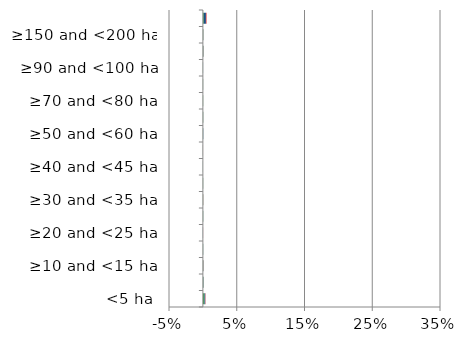
| Category | England | Scotland | Wales |
|---|---|---|---|
| <5 ha | 0.002 | 0.001 | 0 |
| ≥5 and <10 ha | 0.001 | 0 | 0 |
| ≥10 and <15 ha | 0.001 | 0 | 0 |
| ≥15 and <20 ha | 0 | 0 | 0 |
| ≥20 and <25 ha | 0 | 0 | 0 |
| ≥25 and <30 ha | 0 | 0 | 0 |
| ≥30 and <35 ha | 0 | 0 | 0 |
| ≥35 and <40 ha | 0 | 0 | 0 |
| ≥40 and <45 ha | 0 | 0 | 0 |
| ≥45 and <50 ha | 0 | 0 | 0 |
| ≥50 and <60 ha | 0 | 0 | 0 |
| ≥60 and <70 ha | 0 | 0 | 0 |
| ≥70 and <80 ha | 0 | 0 | 0 |
| ≥80 and <90 ha | 0 | 0 | 0 |
| ≥90 and <100 ha | 0 | 0 | 0 |
| ≥100 and <150 ha | 0.001 | 0 | 0 |
| ≥150 and <200 ha | 0.001 | 0 | 0 |
| ≥200 ha | 0.001 | 0.003 | 0.001 |